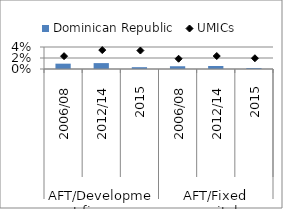
| Category | Dominican Republic |
|---|---|
| 0 | 0.01 |
| 1 | 0.011 |
| 2 | 0.003 |
| 3 | 0.005 |
| 4 | 0.006 |
| 5 | 0.002 |